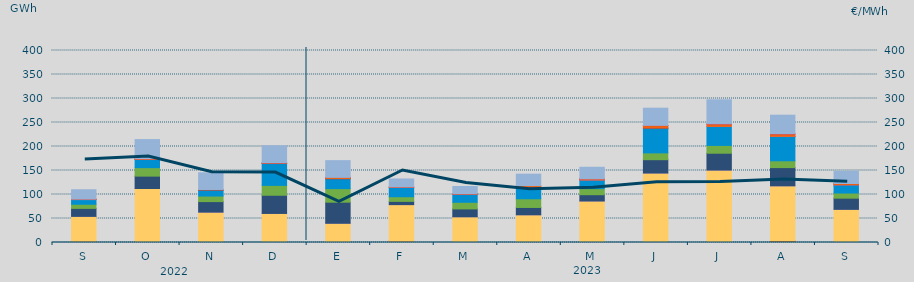
| Category | Carbón | Ciclo Combinado | Cogeneración | Consumo Bombeo | Eólica | Hidráulica | Nuclear | Otras Renovables | Solar fotovoltaica | Solar térmica | Turbinación bombeo |
|---|---|---|---|---|---|---|---|---|---|---|---|
| S | 2432.475 | 52018.85 | 0.5 | 16627 | 8549.825 | 9810.3 | 0 | 23 | 777.175 | 6.75 | 19642.325 |
| O | 1876.1 | 110603.205 | 45 | 25745.4 | 17659.375 | 17006.05 | 12.825 | 16.6 | 1409.775 | 15.5 | 40055.836 |
| N | 1396.025 | 61724.955 | 198.008 | 21869.975 | 11579.495 | 12449.175 | 266.725 | 0 | 996.225 | 0 | 34713.224 |
| D | 1126.208 | 59335.684 | 104.85 | 37837.8 | 20596.98 | 45465.168 | 544.3 | 0 | 1011.875 | 1.5 | 35471.986 |
| E | 478.95 | 39560.875 | 26.867 | 43909.242 | 28275.092 | 20601.292 | 143.6 | 0 | 2603.242 | 1.5 | 34937.333 |
| F | 2850.925 | 76083.275 | 1.55 | 6739.65 | 9661.175 | 19240.1 | 0 | 0 | 962.675 | 47.25 | 16781.025 |
| M | 1195.025 | 52392.533 | 3.3 | 16393.158 | 13789.6 | 16980.517 | 40.625 | 4.5 | 911.6 | 43.15 | 14940.475 |
| A | 218.875 | 57485.65 | 46.225 | 15258.175 | 18096.25 | 24086.65 | 63.45 | 0 | 3316.075 | 0 | 23819.559 |
| M | 150.482 | 86315.465 | 30 | 13099.874 | 12607.441 | 17784.926 | 256.325 | 2 | 2256.963 | 1.5 | 24199.004 |
| J | 1968.975 | 142738.351 | 35.225 | 27797.375 | 14167.175 | 51399.925 | 228.125 | 0 | 5290.65 | 319.5 | 35835.25 |
| J | 1606.69 | 149175.946 | 137.975 | 35048.925 | 16290.2 | 39637.497 | 0 | 5 | 4774.95 | 398.125 | 50276.3 |
| A | 2991.569 | 115032.711 | 108.25 | 37912.341 | 14171.547 | 50649.252 | 261.175 | 69.9 | 4696.2 | 414.625 | 38918.209 |
| S | 1098.882 | 67978.9 | 0.25 | 23304.2 | 10673.95 | 16895.894 | 188.6 | 32.7 | 2616.325 | 77.25 | 25361.951 |